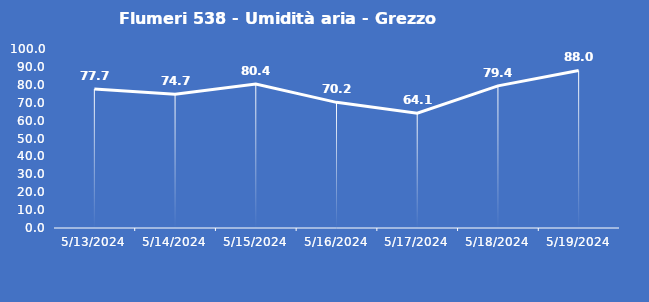
| Category | Flumeri 538 - Umidità aria - Grezzo (%) |
|---|---|
| 5/13/24 | 77.7 |
| 5/14/24 | 74.7 |
| 5/15/24 | 80.4 |
| 5/16/24 | 70.2 |
| 5/17/24 | 64.1 |
| 5/18/24 | 79.4 |
| 5/19/24 | 88 |